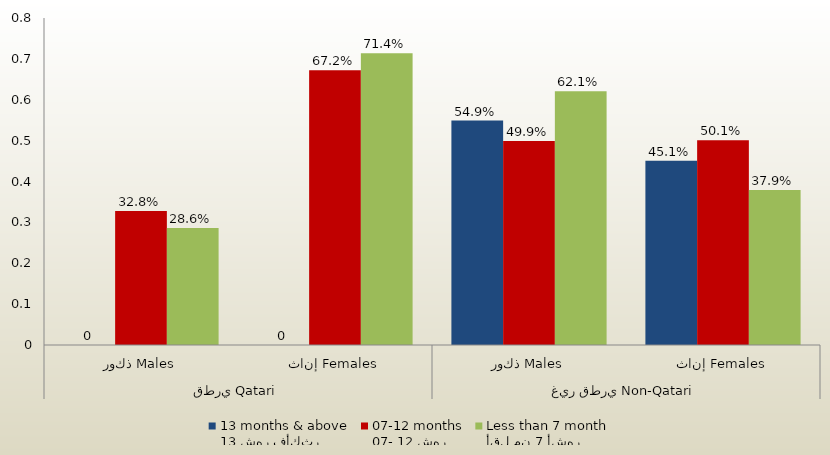
| Category | 13 شهر فأكثر
13 months & above | 07- 12 شهر
07-12 months | أقل من 7 أشهر
Less than 7 month  |
|---|---|---|---|
| 0 | 0 | 0.328 | 0.286 |
| 1 | 0 | 0.672 | 0.714 |
| 2 | 0.549 | 0.499 | 0.621 |
| 3 | 0.451 | 0.501 | 0.379 |